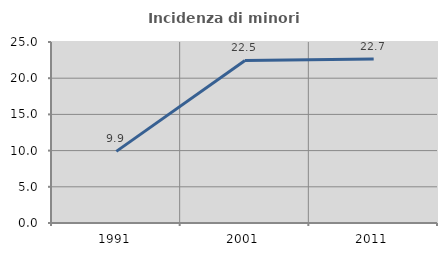
| Category | Incidenza di minori stranieri |
|---|---|
| 1991.0 | 9.89 |
| 2001.0 | 22.453 |
| 2011.0 | 22.667 |